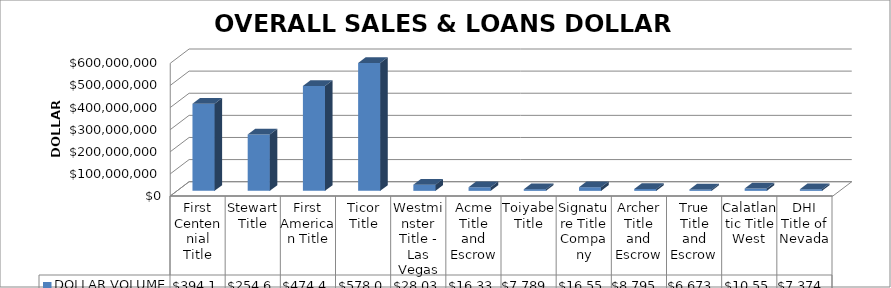
| Category | DOLLAR VOLUME |
|---|---|
| First Centennial Title | 394181270 |
| Stewart Title | 254641256.83 |
| First American Title | 474447936.75 |
| Ticor Title | 578057807.6 |
| Westminster Title - Las Vegas | 28032577 |
| Acme Title and Escrow | 16331037 |
| Toiyabe Title | 7789474 |
| Signature Title Company | 16555623 |
| Archer Title and Escrow | 8795832 |
| True Title and Escrow | 6673065 |
| Calatlantic Title West | 10556939 |
| DHI Title of Nevada | 7374330 |